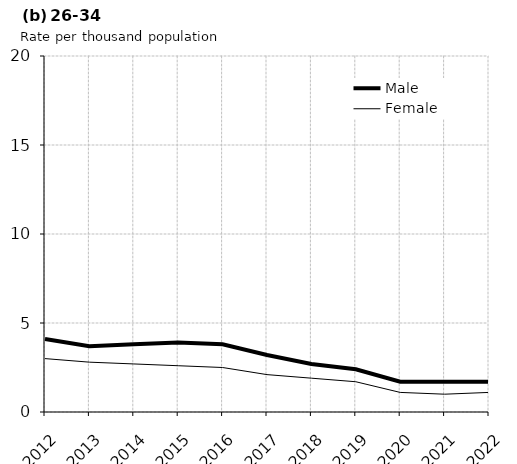
| Category | Male | Female |
|---|---|---|
| 2012.0 | 4.1 | 3 |
| 2013.0 | 3.7 | 2.8 |
| 2014.0 | 3.8 | 2.7 |
| 2015.0 | 3.9 | 2.6 |
| 2016.0 | 3.8 | 2.5 |
| 2017.0 | 3.2 | 2.1 |
| 2018.0 | 2.7 | 1.9 |
| 2019.0 | 2.4 | 1.7 |
| 2020.0 | 1.7 | 1.1 |
| 2021.0 | 1.7 | 1 |
| 2022.0 | 1.7 | 1.1 |